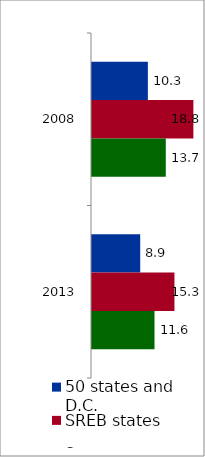
| Category | 50 states and D.C. | SREB states | State |
|---|---|---|---|
| 2008 | 10.346 | 18.776 | 13.663 |
| 2013 | 8.928 | 15.269 | 11.576 |